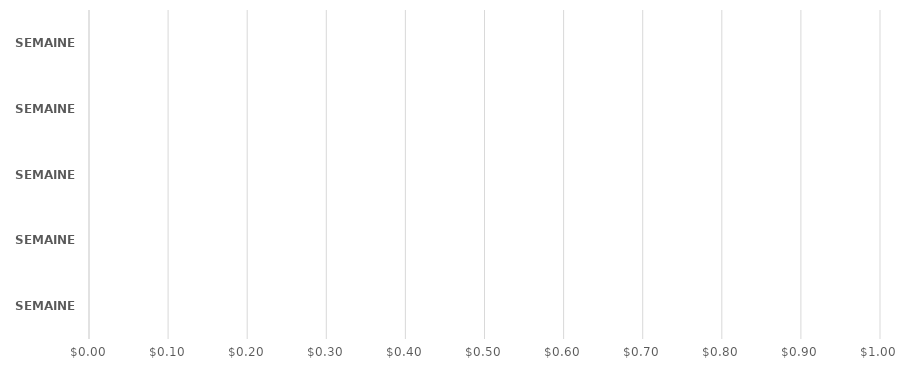
| Category | Series 0 |
|---|---|
| SEMAINE 1 | 0 |
| SEMAINE 2 | 0 |
| SEMAINE 3 | 0 |
| SEMAINE 4 | 0 |
| SEMAINE 5 | 0 |